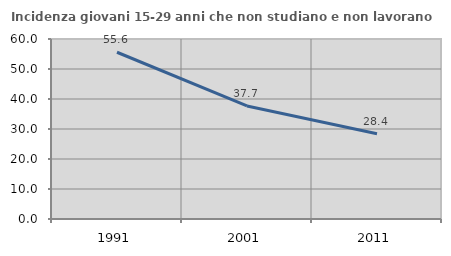
| Category | Incidenza giovani 15-29 anni che non studiano e non lavorano  |
|---|---|
| 1991.0 | 55.587 |
| 2001.0 | 37.69 |
| 2011.0 | 28.435 |